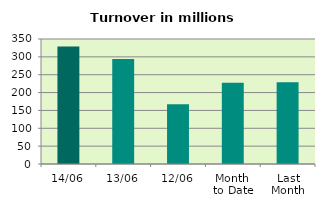
| Category | Series 0 |
|---|---|
| 14/06 | 329.052 |
| 13/06 | 293.849 |
| 12/06 | 167.199 |
| Month 
to Date | 227.479 |
| Last
Month | 228.645 |